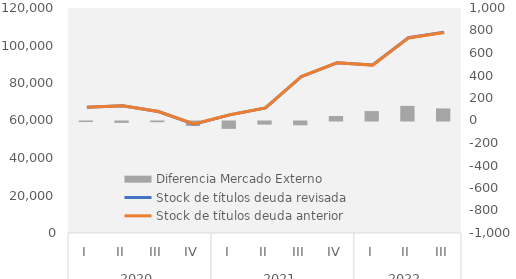
| Category | Diferencia Mercado Externo |
|---|---|
| 0 | -4.313 |
| 1 | -11.943 |
| 2 | -6.513 |
| 3 | -40.026 |
| 4 | -65.351 |
| 5 | -27.676 |
| 6 | -33.658 |
| 7 | 39.605 |
| 8 | 83.815 |
| 9 | 129.878 |
| 10 | 107.128 |